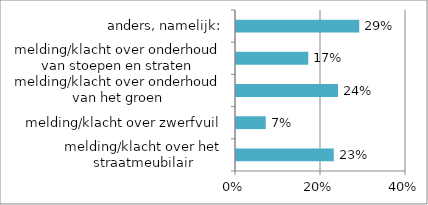
| Category | Series 0 |
|---|---|
| melding/klacht over het straatmeubilair | 0.23 |
| melding/klacht over zwerfvuil | 0.07 |
| melding/klacht over onderhoud van het groen | 0.24 |
| melding/klacht over onderhoud van stoepen en straten | 0.17 |
| anders, namelijk: | 0.29 |